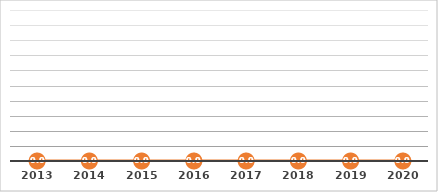
| Category | ADMINISTRATIVOS POR COMPUTADORA (%) |
|---|---|
| 2013.0 | 0 |
| 2014.0 | 0 |
| 2015.0 | 0 |
| 2016.0 | 0 |
| 2017.0 | 0 |
| 2018.0 | 0 |
| 2019.0 | 0 |
| 2020.0 | 0 |